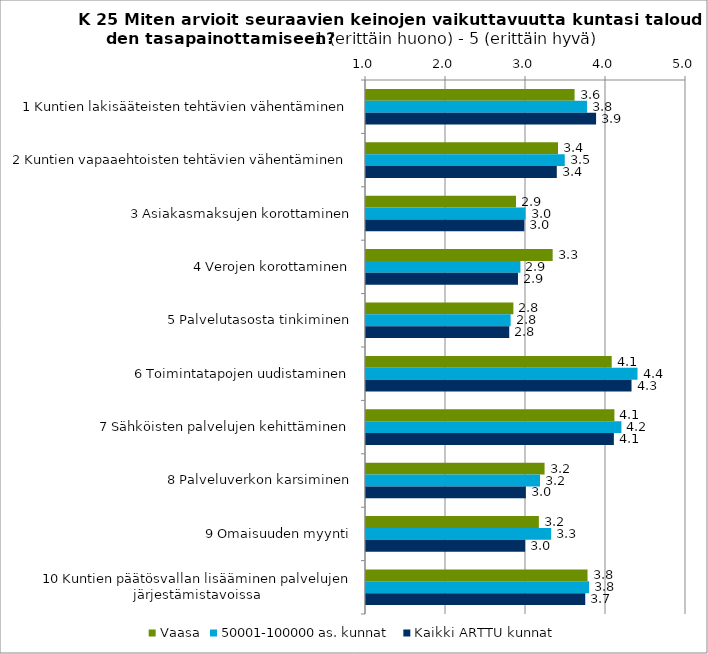
| Category | Vaasa | 50001-100000 as. kunnat | Kaikki ARTTU kunnat |
|---|---|---|---|
| 1 Kuntien lakisääteisten tehtävien vähentäminen | 3.607 | 3.764 | 3.876 |
| 2 Kuntien vapaaehtoisten tehtävien vähentäminen | 3.4 | 3.485 | 3.385 |
| 3 Asiakasmaksujen korottaminen | 2.875 | 2.994 | 2.979 |
| 4 Verojen korottaminen | 3.333 | 2.93 | 2.9 |
| 5 Palvelutasosta tinkiminen | 2.842 | 2.808 | 2.791 |
| 6 Toimintatapojen uudistaminen | 4.071 | 4.394 | 4.319 |
| 7 Sähköisten palvelujen kehittäminen | 4.105 | 4.193 | 4.098 |
| 8 Palveluverkon karsiminen | 3.232 | 3.175 | 2.998 |
| 9 Omaisuuden myynti | 3.161 | 3.315 | 2.989 |
| 10 Kuntien päätösvallan lisääminen palvelujen järjestämistavoissa | 3.769 | 3.789 | 3.741 |